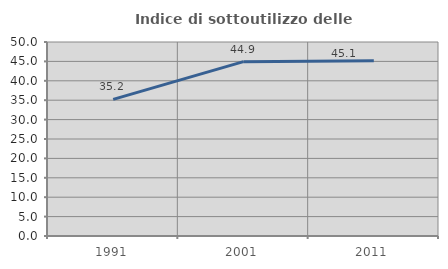
| Category | Indice di sottoutilizzo delle abitazioni  |
|---|---|
| 1991.0 | 35.221 |
| 2001.0 | 44.934 |
| 2011.0 | 45.141 |